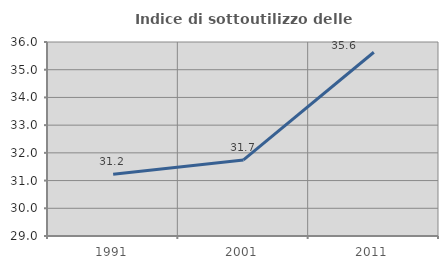
| Category | Indice di sottoutilizzo delle abitazioni  |
|---|---|
| 1991.0 | 31.229 |
| 2001.0 | 31.744 |
| 2011.0 | 35.63 |